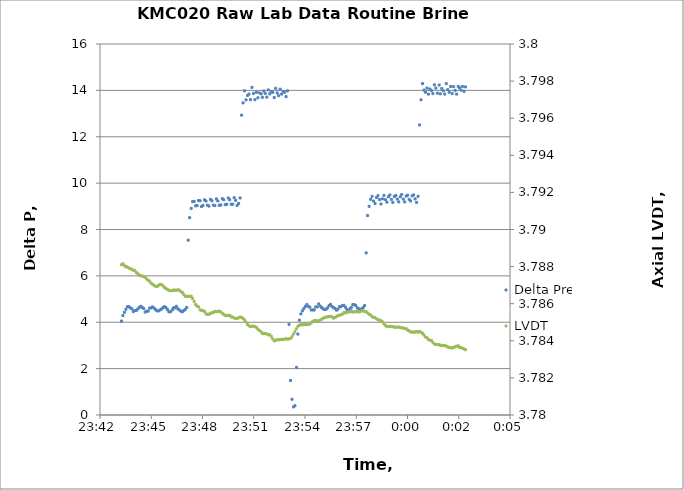
| Category | Delta Press |
|---|---|
| 20.988837731481482 | 4.05 |
| 20.988895601851855 | 4.29 |
| 20.988953472222224 | 4.43 |
| 20.989011342592594 | 4.56 |
| 20.989069212962963 | 4.67 |
| 20.989127083333333 | 4.67 |
| 20.989184953703703 | 4.62 |
| 20.989242824074076 | 4.58 |
| 20.989300694444445 | 4.46 |
| 20.989358564814815 | 4.51 |
| 20.989416435185188 | 4.51 |
| 20.989474305555557 | 4.57 |
| 20.989532175925927 | 4.64 |
| 20.989590046296296 | 4.69 |
| 20.989647916666666 | 4.64 |
| 20.98970578703704 | 4.59 |
| 20.98976365740741 | 4.44 |
| 20.989821527777778 | 4.48 |
| 20.98987939814815 | 4.48 |
| 20.98993726851852 | 4.61 |
| 20.98999513888889 | 4.62 |
| 20.99005300925926 | 4.66 |
| 20.99011087962963 | 4.61 |
| 20.99016875 | 4.54 |
| 20.990226620370372 | 4.49 |
| 20.99028449074074 | 4.49 |
| 20.99034236111111 | 4.53 |
| 20.990400231481484 | 4.57 |
| 20.990458101851853 | 4.63 |
| 20.990515972222223 | 4.67 |
| 20.990573842592593 | 4.63 |
| 20.990631712962962 | 4.55 |
| 20.990689583333335 | 4.45 |
| 20.990747453703705 | 4.45 |
| 20.990819212962965 | 4.53 |
| 20.990863194444447 | 4.62 |
| 20.990921064814817 | 4.62 |
| 20.990978935185186 | 4.69 |
| 20.991036805555556 | 4.58 |
| 20.991094675925925 | 4.53 |
| 20.991152546296295 | 4.48 |
| 20.991210416666668 | 4.45 |
| 20.991268287037038 | 4.5 |
| 20.99132615740741 | 4.55 |
| 20.99138402777778 | 4.64 |
| 20.99144189814815 | 7.54 |
| 20.99149976851852 | 8.51 |
| 20.99155763888889 | 8.91 |
| 20.99161550925926 | 9.2 |
| 20.99167337962963 | 9.21 |
| 20.99173125 | 9.02 |
| 20.99178912037037 | 9.03 |
| 20.991846990740743 | 9.25 |
| 20.991904861111113 | 9.24 |
| 20.991962731481483 | 8.99 |
| 20.992020601851852 | 9.04 |
| 20.99207847222222 | 9.28 |
| 20.99213634259259 | 9.23 |
| 20.992194212962964 | 9.05 |
| 20.992252083333334 | 9.01 |
| 20.992309953703707 | 9.3 |
| 20.992367824074076 | 9.24 |
| 20.992425694444446 | 9.05 |
| 20.992483564814815 | 9.03 |
| 20.992541435185185 | 9.32 |
| 20.992599305555554 | 9.23 |
| 20.992657175925928 | 9.04 |
| 20.992715046296297 | 9.06 |
| 20.992772916666667 | 9.33 |
| 20.99283078703704 | 9.28 |
| 20.99288865740741 | 9.07 |
| 20.99294652777778 | 9.09 |
| 20.99300439814815 | 9.36 |
| 20.993062268518518 | 9.28 |
| 20.99312013888889 | 9.09 |
| 20.99317800925926 | 9.09 |
| 20.99323587962963 | 9.37 |
| 20.993293750000003 | 9.26 |
| 20.993351620370373 | 9.04 |
| 20.993409490740742 | 9.12 |
| 20.99346736111111 | 9.36 |
| 20.99352523148148 | 12.93 |
| 20.99358310185185 | 13.46 |
| 20.993640972222224 | 13.98 |
| 20.993698842592593 | 13.59 |
| 20.993756712962963 | 13.78 |
| 20.993814583333336 | 13.84 |
| 20.993872453703705 | 13.6 |
| 20.993930324074075 | 14.13 |
| 20.993988194444444 | 13.87 |
| 20.994046064814814 | 13.6 |
| 20.994103935185187 | 13.92 |
| 20.994161805555557 | 13.68 |
| 20.994219675925926 | 13.89 |
| 20.99429189814815 | 13.85 |
| 20.99433541666667 | 13.7 |
| 20.994393287037038 | 13.97 |
| 20.994451157407408 | 13.87 |
| 20.994509027777777 | 13.71 |
| 20.994566898148147 | 14.02 |
| 20.99462476851852 | 13.85 |
| 20.99468263888889 | 13.94 |
| 20.99474050925926 | 13.92 |
| 20.994798379629632 | 13.69 |
| 20.99485625 | 14.09 |
| 20.99491412037037 | 13.89 |
| 20.99497199074074 | 13.77 |
| 20.99502986111111 | 14.05 |
| 20.995087731481483 | 13.84 |
| 20.995145601851853 | 13.95 |
| 20.995203472222222 | 13.92 |
| 20.995261342592595 | 13.73 |
| 20.995319212962965 | 13.98 |
| 20.995377083333334 | 3.91 |
| 20.995434953703704 | 1.49 |
| 20.995492824074073 | 0.68 |
| 20.995550694444443 | 0.35 |
| 20.995608564814816 | 0.4 |
| 20.995666435185186 | 2.05 |
| 20.99572430555556 | 3.49 |
| 20.995782175925928 | 4.09 |
| 20.995840046296298 | 4.36 |
| 20.995897916666667 | 4.49 |
| 20.995955787037037 | 4.59 |
| 20.996013657407406 | 4.68 |
| 20.99607152777778 | 4.76 |
| 20.99612939814815 | 4.69 |
| 20.99618726851852 | 4.65 |
| 20.99624513888889 | 4.53 |
| 20.99630300925926 | 4.53 |
| 20.99636087962963 | 4.53 |
| 20.99641875 | 4.66 |
| 20.99647662037037 | 4.66 |
| 20.996534490740743 | 4.79 |
| 20.996592361111112 | 4.7 |
| 20.996650231481482 | 4.63 |
| 20.996708101851855 | 4.58 |
| 20.996765972222224 | 4.55 |
| 20.996823842592594 | 4.56 |
| 20.996881712962963 | 4.62 |
| 20.996939583333333 | 4.72 |
| 20.996997453703703 | 4.77 |
| 20.997055324074076 | 4.68 |
| 20.997113194444445 | 4.63 |
| 20.997171064814815 | 4.59 |
| 20.997228935185188 | 4.52 |
| 20.997286805555557 | 4.57 |
| 20.997344675925927 | 4.67 |
| 20.997402546296296 | 4.67 |
| 20.997460416666666 | 4.72 |
| 20.99751828703704 | 4.73 |
| 20.99757615740741 | 4.65 |
| 20.997634027777778 | 4.55 |
| 20.99769189814815 | 4.52 |
| 20.997764120370373 | 4.59 |
| 20.99780763888889 | 4.63 |
| 20.99786550925926 | 4.76 |
| 20.99792337962963 | 4.76 |
| 20.99798125 | 4.72 |
| 20.998039120370372 | 4.62 |
| 20.99809699074074 | 4.58 |
| 20.99815486111111 | 4.54 |
| 20.998212731481484 | 4.58 |
| 20.998270601851853 | 4.63 |
| 20.998328472222223 | 4.72 |
| 20.998386342592593 | 6.99 |
| 20.998444212962962 | 8.6 |
| 20.998502083333335 | 9 |
| 20.998559953703705 | 9.3 |
| 20.998617824074074 | 9.43 |
| 20.998675694444447 | 9.23 |
| 20.998733564814817 | 9.12 |
| 20.998791435185186 | 9.38 |
| 20.998849305555556 | 9.46 |
| 20.998907175925925 | 9.29 |
| 20.998965046296295 | 9.1 |
| 20.999022916666668 | 9.32 |
| 20.999080787037038 | 9.47 |
| 20.99913865740741 | 9.29 |
| 20.99919652777778 | 9.18 |
| 20.99925439814815 | 9.41 |
| 20.99931226851852 | 9.49 |
| 20.99937013888889 | 9.3 |
| 20.99942800925926 | 9.17 |
| 20.99948587962963 | 9.42 |
| 20.99954375 | 9.47 |
| 20.99960162037037 | 9.31 |
| 20.999659490740743 | 9.19 |
| 20.999717361111113 | 9.41 |
| 20.999775231481483 | 9.51 |
| 20.999833101851852 | 9.31 |
| 20.99989097222222 | 9.19 |
| 20.99994884259259 | 9.44 |
| 21.000006712962964 | 9.48 |
| 21.000064583333334 | 9.3 |
| 21.000122453703707 | 9.23 |
| 21.000180324074076 | 9.45 |
| 21.000238194444446 | 9.49 |
| 21.000296064814815 | 9.32 |
| 21.000353935185185 | 9.17 |
| 21.000411805555554 | 9.43 |
| 21.000469675925928 | 12.51 |
| 21.000527546296297 | 13.59 |
| 21.000585416666667 | 14.29 |
| 21.00064328703704 | 14.01 |
| 21.00070115740741 | 13.92 |
| 21.00075902777778 | 14.1 |
| 21.00081689814815 | 13.84 |
| 21.000874768518518 | 14.06 |
| 21.00093263888889 | 13.99 |
| 21.00099050925926 | 13.86 |
| 21.00104837962963 | 14.24 |
| 21.001106250000003 | 14.1 |
| 21.001164120370373 | 13.88 |
| 21.00123576388889 | 14.23 |
| 21.00127986111111 | 13.85 |
| 21.00133773148148 | 14.08 |
| 21.00139560185185 | 13.98 |
| 21.001453472222224 | 13.84 |
| 21.001511342592593 | 14.29 |
| 21.001569212962963 | 14.03 |
| 21.001627083333336 | 13.92 |
| 21.001684953703705 | 14.17 |
| 21.001742824074075 | 13.86 |
| 21.001800694444444 | 14.16 |
| 21.001858564814814 | 14 |
| 21.001916435185187 | 13.84 |
| 21.001980902777778 | 14.17 |
| 21.002032175925926 | 14.11 |
| 21.0020900462963 | 14.01 |
| 21.00214791666667 | 14.17 |
| 21.002205787037038 | 13.96 |
| 21.002263657407408 | 14.15 |